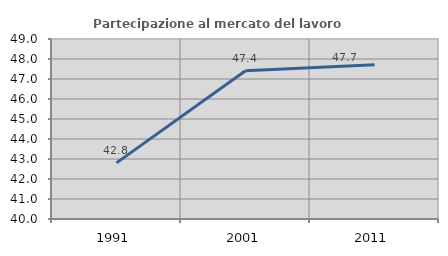
| Category | Partecipazione al mercato del lavoro  femminile |
|---|---|
| 1991.0 | 42.807 |
| 2001.0 | 47.414 |
| 2011.0 | 47.716 |